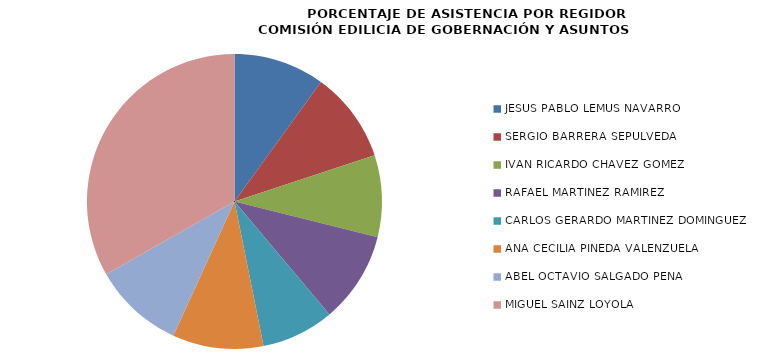
| Category | Series 0 |
|---|---|
| JESÚS PABLO LEMUS NAVARRO | 100 |
| SERGIO BARRERA SEPÚLVEDA | 100 |
| IVÁN RICARDO CHÁVEZ GÓMEZ | 90 |
| RAFAEL MARTÍNEZ RAMÍREZ | 100 |
| CARLOS GERARDO MARTÍNEZ DOMÍNGUEZ | 80 |
| ANA CECILIA PINEDA VALENZUELA | 100 |
| ABEL OCTAVIO SALGADO PEÑA | 100 |
| MIGUEL SAINZ LOYOLA | 333.333 |